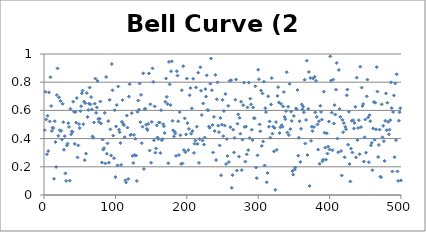
| Category | Bell Curve (2 dice) |
|---|---|
| 0 | 0.46 |
| 1 | 0.732 |
| 2 | 0.536 |
| 3 | 0.288 |
| 4 | 0.562 |
| 5 | 0.312 |
| 6 | 0.728 |
| 7 | 0.522 |
| 8 | 0.835 |
| 9 | 0.631 |
| 10 | 0.454 |
| 11 | 0.478 |
| 12 | 0.474 |
| 13 | 0.115 |
| 14 | 0.523 |
| 15 | 0.375 |
| 16 | 0.199 |
| 17 | 0.709 |
| 18 | 0.898 |
| 19 | 0.42 |
| 20 | 0.693 |
| 21 | 0.459 |
| 22 | 0.667 |
| 23 | 0.454 |
| 24 | 0.394 |
| 25 | 0.647 |
| 26 | 0.517 |
| 27 | 0.321 |
| 28 | 0.417 |
| 29 | 0.153 |
| 30 | 0.1 |
| 31 | 0.351 |
| 32 | 0.364 |
| 33 | 0.51 |
| 34 | 0.482 |
| 35 | 0.102 |
| 36 | 0.612 |
| 37 | 0.43 |
| 38 | 0.451 |
| 39 | 0.448 |
| 40 | 0.662 |
| 41 | 0.59 |
| 42 | 0.363 |
| 43 | 0.589 |
| 44 | 0.513 |
| 45 | 0.687 |
| 46 | 0.267 |
| 47 | 0.352 |
| 48 | 0.503 |
| 49 | 0.475 |
| 50 | 0.595 |
| 51 | 0.63 |
| 52 | 0.721 |
| 53 | 0.74 |
| 54 | 0.503 |
| 55 | 0.662 |
| 56 | 0.247 |
| 57 | 0.651 |
| 58 | 0.294 |
| 59 | 0.723 |
| 60 | 0.553 |
| 61 | 0.603 |
| 62 | 0.648 |
| 63 | 0.762 |
| 64 | 0.643 |
| 65 | 0.694 |
| 66 | 0.607 |
| 67 | 0.416 |
| 68 | 0.406 |
| 69 | 0.515 |
| 70 | 0.648 |
| 71 | 0.826 |
| 72 | 0.582 |
| 73 | 0.621 |
| 74 | 0.809 |
| 75 | 0.54 |
| 76 | 0.518 |
| 77 | 0.541 |
| 78 | 0.663 |
| 79 | 0.507 |
| 80 | 0.231 |
| 81 | 0.394 |
| 82 | 0.322 |
| 83 | 0.332 |
| 84 | 0.582 |
| 85 | 0.224 |
| 86 | 0.837 |
| 87 | 0.292 |
| 88 | 0.366 |
| 89 | 0.524 |
| 90 | 0.229 |
| 91 | 0.675 |
| 92 | 0.466 |
| 93 | 0.28 |
| 94 | 0.929 |
| 95 | 0.743 |
| 96 | 0.421 |
| 97 | 0.261 |
| 98 | 0.601 |
| 99 | 0.127 |
| 100 | 0.487 |
| 101 | 0.638 |
| 102 | 0.21 |
| 103 | 0.77 |
| 104 | 0.463 |
| 105 | 0.446 |
| 106 | 0.368 |
| 107 | 0.213 |
| 108 | 0.52 |
| 109 | 0.673 |
| 110 | 0.504 |
| 111 | 0.495 |
| 112 | 0.41 |
| 113 | 0.104 |
| 114 | 0.089 |
| 115 | 0.564 |
| 116 | 0.478 |
| 117 | 0.114 |
| 118 | 0.698 |
| 119 | 0.786 |
| 120 | 0.425 |
| 121 | 0.429 |
| 122 | 0.581 |
| 123 | 0.278 |
| 124 | 0.227 |
| 125 | 0.426 |
| 126 | 0.284 |
| 127 | 0.398 |
| 128 | 0.279 |
| 129 | 0.1 |
| 130 | 0.59 |
| 131 | 0.67 |
| 132 | 0.605 |
| 133 | 0.791 |
| 134 | 0.517 |
| 135 | 0.71 |
| 136 | 0.368 |
| 137 | 0.484 |
| 138 | 0.863 |
| 139 | 0.185 |
| 140 | 0.61 |
| 141 | 0.612 |
| 142 | 0.499 |
| 143 | 0.469 |
| 144 | 0.461 |
| 145 | 0.504 |
| 146 | 0.862 |
| 147 | 0.315 |
| 148 | 0.643 |
| 149 | 0.229 |
| 150 | 0.518 |
| 151 | 0.898 |
| 152 | 0.802 |
| 153 | 0.388 |
| 154 | 0.629 |
| 155 | 0.3 |
| 156 | 0.331 |
| 157 | 0.494 |
| 158 | 0.408 |
| 159 | 0.398 |
| 160 | 0.514 |
| 161 | 0.514 |
| 162 | 0.298 |
| 163 | 0.601 |
| 164 | 0.389 |
| 165 | 0.396 |
| 166 | 0.502 |
| 167 | 0.487 |
| 168 | 0.439 |
| 169 | 0.661 |
| 170 | 0.826 |
| 171 | 0.696 |
| 172 | 0.645 |
| 173 | 0.226 |
| 174 | 0.944 |
| 175 | 0.785 |
| 176 | 0.638 |
| 177 | 0.878 |
| 178 | 0.948 |
| 179 | 0.526 |
| 180 | 0.459 |
| 181 | 0.416 |
| 182 | 0.449 |
| 183 | 0.436 |
| 184 | 0.278 |
| 185 | 0.878 |
| 186 | 0.847 |
| 187 | 0.523 |
| 188 | 0.284 |
| 189 | 0.588 |
| 190 | 0.424 |
| 191 | 0.22 |
| 192 | 0.743 |
| 193 | 0.224 |
| 194 | 0.913 |
| 195 | 0.319 |
| 196 | 0.543 |
| 197 | 0.304 |
| 198 | 0.429 |
| 199 | 0.826 |
| 200 | 0.51 |
| 201 | 0.318 |
| 202 | 0.469 |
| 203 | 0.708 |
| 204 | 0.758 |
| 205 | 0.434 |
| 206 | 0.614 |
| 207 | 0.453 |
| 208 | 0.824 |
| 209 | 0.298 |
| 210 | 0.364 |
| 211 | 0.386 |
| 212 | 0.763 |
| 213 | 0.484 |
| 214 | 0.363 |
| 215 | 0.868 |
| 216 | 0.228 |
| 217 | 0.397 |
| 218 | 0.906 |
| 219 | 0.74 |
| 220 | 0.567 |
| 221 | 0.386 |
| 222 | 0.649 |
| 223 | 0.358 |
| 224 | 0.407 |
| 225 | 0.752 |
| 226 | 0.698 |
| 227 | 0.849 |
| 228 | 0.604 |
| 229 | 0.6 |
| 230 | 0.485 |
| 231 | 0.477 |
| 232 | 0.79 |
| 233 | 0.968 |
| 234 | 0.743 |
| 235 | 0.497 |
| 236 | 0.301 |
| 237 | 0.554 |
| 238 | 0.454 |
| 239 | 0.852 |
| 240 | 0.248 |
| 241 | 0.679 |
| 242 | 0.799 |
| 243 | 0.491 |
| 244 | 0.446 |
| 245 | 0.351 |
| 246 | 0.547 |
| 247 | 0.14 |
| 248 | 0.499 |
| 249 | 0.675 |
| 250 | 0.418 |
| 251 | 0.595 |
| 252 | 0.492 |
| 253 | 0.717 |
| 254 | 0.22 |
| 255 | 0.397 |
| 256 | 0.277 |
| 257 | 0.632 |
| 258 | 0.234 |
| 259 | 0.811 |
| 260 | 0.481 |
| 261 | 0.814 |
| 262 | 0.051 |
| 263 | 0.141 |
| 264 | 0.463 |
| 265 | 0.302 |
| 266 | 0.405 |
| 267 | 0.676 |
| 268 | 0.82 |
| 269 | 0.174 |
| 270 | 0.505 |
| 271 | 0.572 |
| 272 | 0.272 |
| 273 | 0.547 |
| 274 | 0.435 |
| 275 | 0.662 |
| 276 | 0.176 |
| 277 | 0.392 |
| 278 | 0.637 |
| 279 | 0.797 |
| 280 | 0.482 |
| 281 | 0.237 |
| 282 | 0.485 |
| 283 | 0.288 |
| 284 | 0.621 |
| 285 | 0.319 |
| 286 | 0.797 |
| 287 | 0.403 |
| 288 | 0.683 |
| 289 | 0.643 |
| 290 | 0.463 |
| 291 | 0.39 |
| 292 | 0.621 |
| 293 | 0.545 |
| 294 | 0.544 |
| 295 | 0.771 |
| 296 | 0.195 |
| 297 | 0.12 |
| 298 | 0.281 |
| 299 | 0.888 |
| 300 | 0.821 |
| 301 | 0.501 |
| 302 | 0.452 |
| 303 | 0.741 |
| 304 | 0.348 |
| 305 | 0.72 |
| 306 | 0.379 |
| 307 | 0.804 |
| 308 | 0.21 |
| 309 | 0.616 |
| 310 | 0.588 |
| 311 | 0.091 |
| 312 | 0.156 |
| 313 | 0.7 |
| 314 | 0.484 |
| 315 | 0.522 |
| 316 | 0.407 |
| 317 | 0.642 |
| 318 | 0.829 |
| 319 | 0.435 |
| 320 | 0.485 |
| 321 | 0.309 |
| 322 | 0.476 |
| 323 | 0.037 |
| 324 | 0.517 |
| 325 | 0.321 |
| 326 | 0.703 |
| 327 | 0.764 |
| 328 | 0.656 |
| 329 | 0.439 |
| 330 | 0.48 |
| 331 | 0.646 |
| 332 | 0.495 |
| 333 | 0.484 |
| 334 | 0.628 |
| 335 | 0.73 |
| 336 | 0.553 |
| 337 | 0.537 |
| 338 | 0.595 |
| 339 | 0.871 |
| 340 | 0.443 |
| 341 | 0.626 |
| 342 | 0.425 |
| 343 | 0.788 |
| 344 | 0.467 |
| 345 | 0.591 |
| 346 | 0.525 |
| 347 | 0.17 |
| 348 | 0.144 |
| 349 | 0.561 |
| 350 | 0.18 |
| 351 | 0.195 |
| 352 | 0.614 |
| 353 | 0.608 |
| 354 | 0.745 |
| 355 | 0.279 |
| 356 | 0.406 |
| 357 | 0.524 |
| 358 | 0.234 |
| 359 | 0.469 |
| 360 | 0.643 |
| 361 | 0.607 |
| 362 | 0.627 |
| 363 | 0.587 |
| 364 | 0.817 |
| 365 | 0.365 |
| 366 | 0.532 |
| 367 | 0.953 |
| 368 | 0.284 |
| 369 | 0.611 |
| 370 | 0.873 |
| 371 | 0.064 |
| 372 | 0.83 |
| 373 | 0.384 |
| 374 | 0.484 |
| 375 | 0.453 |
| 376 | 0.826 |
| 377 | 0.482 |
| 378 | 0.838 |
| 379 | 0.586 |
| 380 | 0.81 |
| 381 | 0.553 |
| 382 | 0.5 |
| 383 | 0.322 |
| 384 | 0.522 |
| 385 | 0.222 |
| 386 | 0.633 |
| 387 | 0.59 |
| 388 | 0.535 |
| 389 | 0.239 |
| 390 | 0.251 |
| 391 | 0.733 |
| 392 | 0.442 |
| 393 | 0.336 |
| 394 | 0.25 |
| 395 | 0.438 |
| 396 | 0.294 |
| 397 | 0.343 |
| 398 | 0.522 |
| 399 | 0.323 |
| 400 | 0.983 |
| 401 | 0.811 |
| 402 | 0.584 |
| 403 | 0.317 |
| 404 | 0.818 |
| 405 | 0.508 |
| 406 | 0.638 |
| 407 | 0.571 |
| 408 | 0.747 |
| 409 | 0.936 |
| 410 | 0.401 |
| 411 | 0.304 |
| 412 | 0.887 |
| 413 | 0.61 |
| 414 | 0.554 |
| 415 | 0.312 |
| 416 | 0.138 |
| 417 | 0.533 |
| 418 | 0.446 |
| 419 | 0.51 |
| 420 | 0.267 |
| 421 | 0.484 |
| 422 | 0.466 |
| 423 | 0.707 |
| 424 | 0.748 |
| 425 | 0.357 |
| 426 | 0.59 |
| 427 | 0.22 |
| 428 | 0.096 |
| 429 | 0.329 |
| 430 | 0.526 |
| 431 | 0.302 |
| 432 | 0.531 |
| 433 | 0.471 |
| 434 | 0.51 |
| 435 | 0.625 |
| 436 | 0.267 |
| 437 | 0.832 |
| 438 | 0.389 |
| 439 | 0.475 |
| 440 | 0.53 |
| 441 | 0.29 |
| 442 | 0.91 |
| 443 | 0.482 |
| 444 | 0.762 |
| 445 | 0.631 |
| 446 | 0.646 |
| 447 | 0.237 |
| 448 | 0.409 |
| 449 | 0.535 |
| 450 | 0.3 |
| 451 | 0.7 |
| 452 | 0.818 |
| 453 | 0.551 |
| 454 | 0.233 |
| 455 | 0.566 |
| 456 | 0.524 |
| 457 | 0.352 |
| 458 | 0.37 |
| 459 | 0.175 |
| 460 | 0.472 |
| 461 | 0.66 |
| 462 | 0.392 |
| 463 | 0.655 |
| 464 | 0.466 |
| 465 | 0.907 |
| 466 | 0.734 |
| 467 | 0.27 |
| 468 | 0.355 |
| 469 | 0.464 |
| 470 | 0.13 |
| 471 | 0.126 |
| 472 | 0.643 |
| 473 | 0.41 |
| 474 | 0.49 |
| 475 | 0.382 |
| 476 | 0.242 |
| 477 | 0.527 |
| 478 | 0.721 |
| 479 | 0.459 |
| 480 | 0.654 |
| 481 | 0.518 |
| 482 | 0.43 |
| 483 | 0.464 |
| 484 | 0.531 |
| 485 | 0.799 |
| 486 | 0.617 |
| 487 | 0.167 |
| 488 | 0.588 |
| 489 | 0.706 |
| 490 | 0.268 |
| 491 | 0.792 |
| 492 | 0.389 |
| 493 | 0.856 |
| 494 | 0.167 |
| 495 | 0.1 |
| 496 | 0.527 |
| 497 | 0.587 |
| 498 | 0.615 |
| 499 | 0.104 |